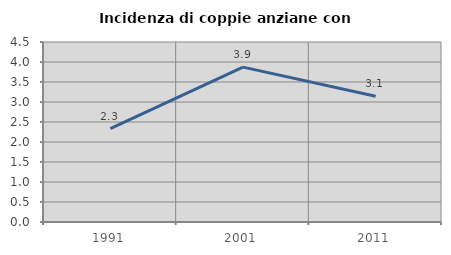
| Category | Incidenza di coppie anziane con figli |
|---|---|
| 1991.0 | 2.336 |
| 2001.0 | 3.872 |
| 2011.0 | 3.144 |